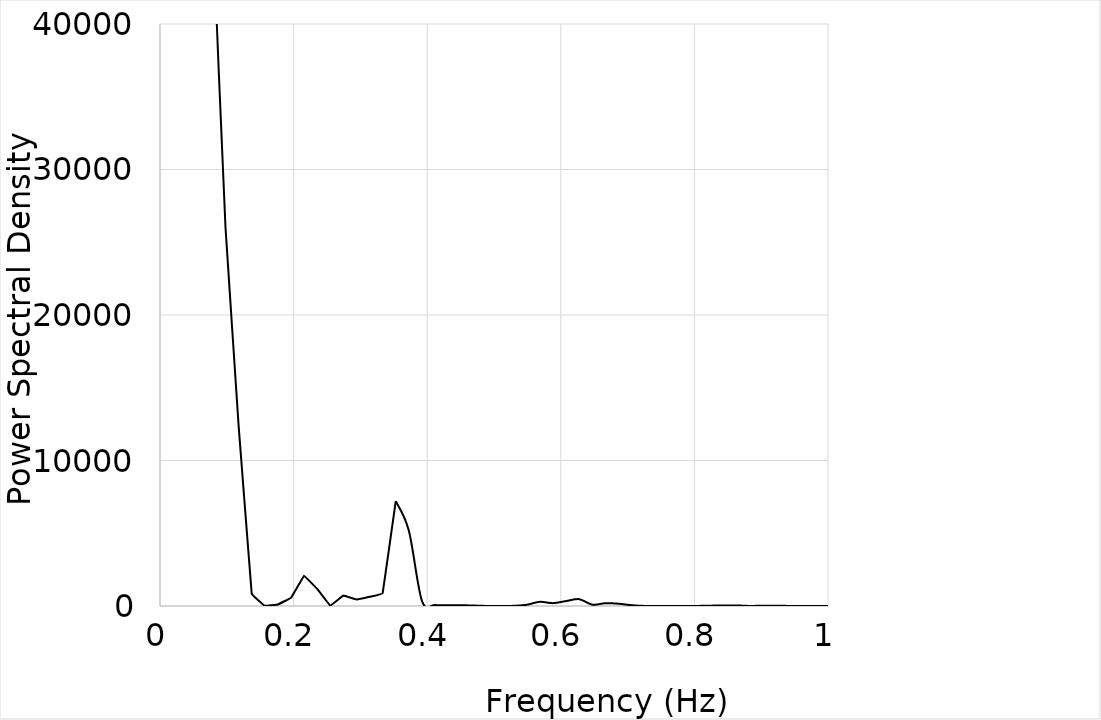
| Category | Propellant rate |
|---|---|
| 0.0 | 5957549.536 |
| 0.0196078431372549 | 1889060.725 |
| 0.0392156862745098 | 118735.587 |
| 0.058823529411764705 | 132810.923 |
| 0.0784313725490196 | 47396.755 |
| 0.09803921568627451 | 26026.856 |
| 0.11764705882352941 | 12419.236 |
| 0.13725490196078433 | 860.385 |
| 0.1568627450980392 | 11.233 |
| 0.1764705882352941 | 105.867 |
| 0.196078431372549 | 558.237 |
| 0.21568627450980388 | 2088.402 |
| 0.23529411764705876 | 1172.652 |
| 0.25490196078431365 | 17.216 |
| 0.27450980392156854 | 715.655 |
| 0.29411764705882343 | 447.861 |
| 0.3137254901960783 | 635.584 |
| 0.3333333333333332 | 879.91 |
| 0.3529411764705881 | 7207.613 |
| 0.372549019607843 | 5167.723 |
| 0.39215686274509787 | 347.125 |
| 0.41176470588235276 | 70.948 |
| 0.43137254901960764 | 59.281 |
| 0.45098039215686253 | 53.119 |
| 0.4705882352941174 | 30.455 |
| 0.4901960784313723 | 3.564 |
| 0.5098039215686272 | 0.747 |
| 0.5294117647058821 | 11.058 |
| 0.5490196078431371 | 85.482 |
| 0.568627450980392 | 286.676 |
| 0.588235294117647 | 196.677 |
| 0.6078431372549019 | 338.467 |
| 0.6274509803921569 | 469.816 |
| 0.6470588235294118 | 92.83 |
| 0.6666666666666667 | 191.234 |
| 0.6862745098039217 | 158.06 |
| 0.7058823529411766 | 54.163 |
| 0.7254901960784316 | 5.455 |
| 0.7450980392156865 | 1.334 |
| 0.7647058823529415 | 0.169 |
| 0.7843137254901964 | 3.228 |
| 0.8039215686274513 | 4.645 |
| 0.8235294117647063 | 22.384 |
| 0.8431372549019612 | 38.59 |
| 0.8627450980392162 | 38.92 |
| 0.8823529411764711 | 5.067 |
| 0.9019607843137261 | 18.43 |
| 0.921568627450981 | 21.59 |
| 0.941176470588236 | 5.85 |
| 0.9607843137254909 | 0.842 |
| 0.9803921568627458 | 0.085 |
| 1.0000000000000007 | 0.002 |
| 1.0196078431372555 | 0.014 |
| 1.0392156862745103 | 0.5 |
| 1.0588235294117652 | 1.423 |
| 1.07843137254902 | 0.69 |
| 1.0980392156862748 | 7.067 |
| 1.1176470588235297 | 21.433 |
| 1.1372549019607845 | 25.149 |
| 1.1568627450980393 | 28.396 |
| 1.1764705882352942 | 27.673 |
| 1.196078431372549 | 18.966 |
| 1.2156862745098038 | 9.698 |
| 1.2352941176470587 | 4.775 |
| 1.2549019607843135 | 0.866 |
| 1.2745098039215683 | 9.818 |
| 1.2941176470588232 | 32.885 |
| 1.313725490196078 | 12.909 |
| 1.3333333333333328 | 2.235 |
| 1.3529411764705876 | 3.193 |
| 1.3725490196078425 | 31.644 |
| 1.3921568627450973 | 3.036 |
| 1.4117647058823521 | 23.272 |
| 1.431372549019607 | 24.131 |
| 1.4509803921568618 | 21.525 |
| 1.4705882352941166 | 19.273 |
| 1.4901960784313715 | 8.236 |
| 1.5098039215686263 | 0.873 |
| 1.5294117647058811 | 5.938 |
| 1.549019607843136 | 20.371 |
| 1.5686274509803908 | 58.194 |
| 1.5882352941176456 | 77.311 |
| 1.6078431372549005 | 45.409 |
| 1.6274509803921553 | 21.684 |
| 1.6470588235294101 | 49.278 |
| 1.666666666666665 | 19.193 |
| 1.6862745098039198 | 8.059 |
| 1.7058823529411746 | 0.416 |
| 1.7254901960784295 | 0.451 |
| 1.7450980392156843 | 0.192 |
| 1.7647058823529391 | 0.023 |
| 1.784313725490194 | 1.526 |
| 1.8039215686274488 | 5.09 |
| 1.8235294117647036 | 1.948 |
| 1.8431372549019585 | 4.284 |
| 1.8627450980392133 | 2.178 |
| 1.8823529411764681 | 3.199 |
| 1.901960784313723 | 2.222 |
| 1.9215686274509778 | 3.338 |
| 1.9411764705882326 | 1.678 |
| 1.9607843137254874 | 0.409 |
| 1.9803921568627423 | 0.048 |
| 1.9999999999999971 | 0.01 |
| 2.019607843137252 | 0.011 |
| 2.039215686274507 | 0.137 |
| 2.058823529411762 | 0.922 |
| 2.0784313725490167 | 2.356 |
| 2.0980392156862715 | 3.869 |
| 2.1176470588235263 | 7.218 |
| 2.137254901960781 | 7.782 |
| 2.156862745098036 | 2.019 |
| 2.176470588235291 | 4.781 |
| 2.1960784313725457 | 4.095 |
| 2.2156862745098005 | 0.378 |
| 2.2352941176470553 | 0.303 |
| 2.25490196078431 | 0.061 |
| 2.274509803921565 | 0.812 |
| 2.29411764705882 | 1.62 |
| 2.3137254901960747 | 1.055 |
| 2.3333333333333295 | 7.219 |
| 2.3529411764705843 | 5.196 |
| 2.372549019607839 | 7.417 |
| 2.392156862745094 | 22.055 |
| 2.411764705882349 | 15.528 |
| 2.4313725490196036 | 2.445 |
| 2.4509803921568585 | 7.002 |
| 2.4705882352941133 | 10.844 |
| 2.490196078431368 | 0.393 |
| 2.509803921568623 | 0.098 |
| 2.529411764705878 | 0.393 |
| 2.5490196078431326 | 10.844 |
| 2.5686274509803875 | 7.002 |
| 2.5882352941176423 | 2.445 |
| 2.607843137254897 | 15.528 |
| 2.627450980392152 | 22.055 |
| 2.647058823529407 | 7.417 |
| 2.6666666666666616 | 5.196 |
| 2.6862745098039165 | 7.219 |
| 2.7058823529411713 | 1.055 |
| 2.725490196078426 | 1.62 |
| 2.745098039215681 | 0.812 |
| 2.764705882352936 | 0.061 |
| 2.7843137254901906 | 0.303 |
| 2.8039215686274455 | 0.378 |
| 2.8235294117647003 | 4.095 |
| 2.843137254901955 | 4.781 |
| 2.86274509803921 | 2.019 |
| 2.882352941176465 | 7.782 |
| 2.9019607843137196 | 7.218 |
| 2.9215686274509745 | 3.869 |
| 2.9411764705882293 | 2.356 |
| 2.960784313725484 | 0.922 |
| 2.980392156862739 | 0.137 |
| 2.999999999999994 | 0.011 |
| 3.0196078431372486 | 0.01 |
| 3.0392156862745034 | 0.048 |
| 3.0588235294117583 | 0.409 |
| 3.078431372549013 | 1.678 |
| 3.098039215686268 | 3.338 |
| 3.1176470588235228 | 2.222 |
| 3.1372549019607776 | 3.199 |
| 3.1568627450980324 | 2.178 |
| 3.1764705882352873 | 4.284 |
| 3.196078431372542 | 1.948 |
| 3.215686274509797 | 5.09 |
| 3.2352941176470518 | 1.526 |
| 3.2549019607843066 | 0.023 |
| 3.2745098039215614 | 0.192 |
| 3.2941176470588163 | 0.451 |
| 3.313725490196071 | 0.416 |
| 3.333333333333326 | 8.059 |
| 3.3529411764705808 | 19.193 |
| 3.3725490196078356 | 49.278 |
| 3.3921568627450904 | 21.684 |
| 3.4117647058823453 | 45.409 |
| 3.4313725490196 | 77.311 |
| 3.450980392156855 | 58.194 |
| 3.4705882352941098 | 20.371 |
| 3.4901960784313646 | 5.938 |
| 3.5098039215686194 | 0.873 |
| 3.5294117647058743 | 8.236 |
| 3.549019607843129 | 19.273 |
| 3.568627450980384 | 21.525 |
| 3.5882352941176388 | 24.131 |
| 3.6078431372548936 | 23.272 |
| 3.6274509803921484 | 3.036 |
| 3.6470588235294032 | 31.644 |
| 3.666666666666658 | 3.193 |
| 3.686274509803913 | 2.235 |
| 3.7058823529411677 | 12.909 |
| 3.7254901960784226 | 32.885 |
| 3.7450980392156774 | 9.818 |
| 3.7647058823529322 | 0.866 |
| 3.784313725490187 | 4.775 |
| 3.803921568627442 | 9.698 |
| 3.8235294117646967 | 18.966 |
| 3.8431372549019516 | 27.673 |
| 3.8627450980392064 | 28.396 |
| 3.8823529411764612 | 25.149 |
| 3.901960784313716 | 21.433 |
| 3.921568627450971 | 7.067 |
| 3.9411764705882257 | 0.69 |
| 3.9607843137254806 | 1.423 |
| 3.9803921568627354 | 0.5 |
| 3.9999999999999902 | 0.014 |
| 4.019607843137245 | 0.002 |
| 4.0392156862745 | 0.085 |
| 4.058823529411755 | 0.842 |
| 4.07843137254901 | 5.85 |
| 4.098039215686264 | 21.59 |
| 4.117647058823519 | 18.43 |
| 4.137254901960774 | 5.067 |
| 4.156862745098029 | 38.92 |
| 4.176470588235284 | 38.59 |
| 4.1960784313725386 | 22.384 |
| 4.215686274509793 | 4.645 |
| 4.235294117647048 | 3.228 |
| 4.254901960784303 | 0.169 |
| 4.274509803921558 | 1.334 |
| 4.294117647058813 | 5.455 |
| 4.3137254901960675 | 54.163 |
| 4.333333333333322 | 158.06 |
| 4.352941176470577 | 191.234 |
| 4.372549019607832 | 92.83 |
| 4.392156862745087 | 469.816 |
| 4.411764705882342 | 338.467 |
| 4.4313725490195965 | 196.677 |
| 4.450980392156851 | 286.676 |
| 4.470588235294106 | 85.482 |
| 4.490196078431361 | 11.058 |
| 4.509803921568616 | 0.747 |
| 4.529411764705871 | 3.564 |
| 4.5490196078431255 | 30.455 |
| 4.56862745098038 | 53.119 |
| 4.588235294117635 | 59.281 |
| 4.60784313725489 | 70.948 |
| 4.627450980392145 | 347.125 |
| 4.6470588235294 | 5167.723 |
| 4.6666666666666545 | 7207.613 |
| 4.686274509803909 | 879.91 |
| 4.705882352941164 | 635.584 |
| 4.725490196078419 | 447.861 |
| 4.745098039215674 | 715.655 |
| 4.764705882352929 | 17.216 |
| 4.7843137254901835 | 1172.652 |
| 4.803921568627438 | 2088.402 |
| 4.823529411764693 | 558.237 |
| 4.843137254901948 | 105.867 |
| 4.862745098039203 | 11.233 |
| 4.882352941176458 | 860.385 |
| 4.9019607843137125 | 12419.236 |
| 4.921568627450967 | 26026.856 |
| 4.941176470588222 | 47396.755 |
| 4.960784313725477 | 132810.923 |
| 4.980392156862732 | 118735.587 |
| 4.999999999999987 | 1889060.725 |